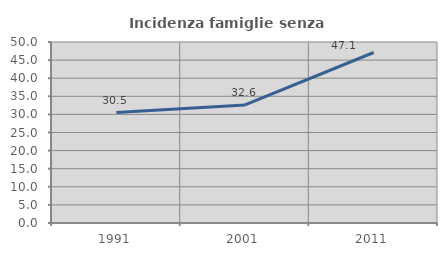
| Category | Incidenza famiglie senza nuclei |
|---|---|
| 1991.0 | 30.502 |
| 2001.0 | 32.605 |
| 2011.0 | 47.097 |